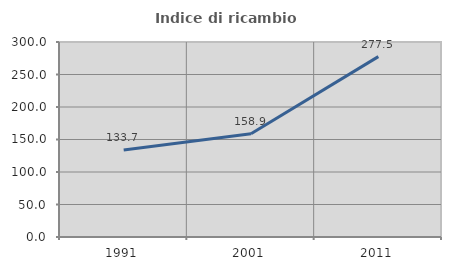
| Category | Indice di ricambio occupazionale  |
|---|---|
| 1991.0 | 133.708 |
| 2001.0 | 158.904 |
| 2011.0 | 277.465 |